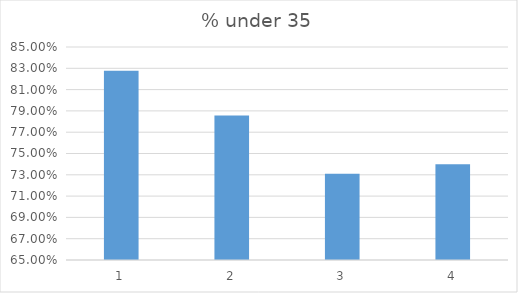
| Category | % under 35 |
|---|---|
| 0 | 0.828 |
| 1 | 0.786 |
| 2 | 0.731 |
| 3 | 0.74 |